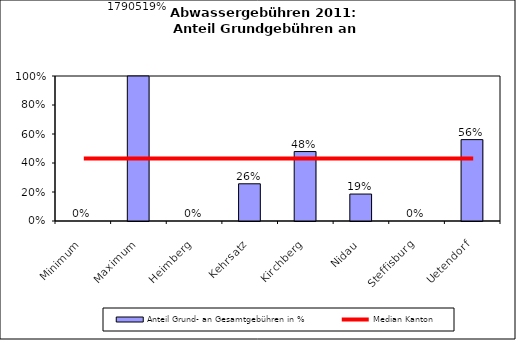
| Category | Anteil Grund- an Gesamtgebühren in % |
|---|---|
| Minimum | 0 |
| Maximum | 17905.192 |
| Heimberg | 0 |
| Kehrsatz | 0.257 |
| Kirchberg | 0.479 |
| Nidau | 0.186 |
| Steffisburg | 0 |
| Uetendorf | 0.561 |